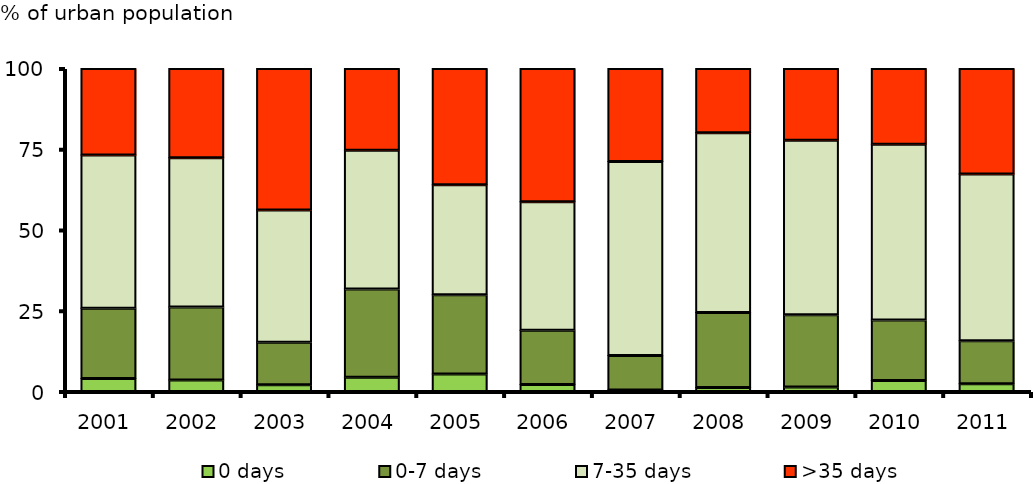
| Category | 0 days | 0-7 days | 7-35 days | >35 days |
|---|---|---|---|---|
| 2001.0 | 4.04 | 21.706 | 47.458 | 26.796 |
| 2002.0 | 3.524 | 22.662 | 46.182 | 27.632 |
| 2003.0 | 2.114 | 13.102 | 40.939 | 43.846 |
| 2004.0 | 4.446 | 27.295 | 42.954 | 25.304 |
| 2005.0 | 5.402 | 24.517 | 34.119 | 35.962 |
| 2006.0 | 2.167 | 16.818 | 39.776 | 41.24 |
| 2007.0 | 0.458 | 10.725 | 60.018 | 28.799 |
| 2008.0 | 1.216 | 23.206 | 55.707 | 19.871 |
| 2009.0 | 1.374 | 22.425 | 53.95 | 22.251 |
| 2010.0 | 3.443 | 18.685 | 54.41 | 23.461 |
| 2011.0 | 2.388 | 13.307 | 51.638 | 32.667 |